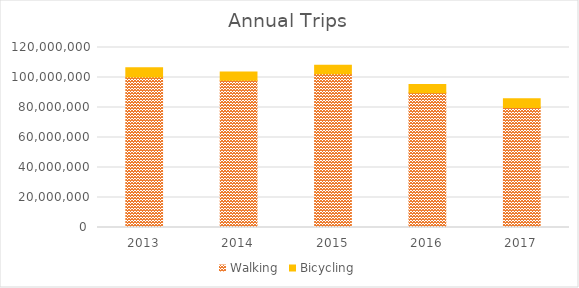
| Category | Walking | Bicycling |
|---|---|---|
| 2013 | 100319851.635 | 6212167.16 |
| 2014 | 98223914.244 | 5430275.164 |
| 2015 | 102521897.527 | 5588206.649 |
| 2016 | 89815633.84 | 5461526.364 |
| 2017 | 80056662.184 | 5852922.784 |